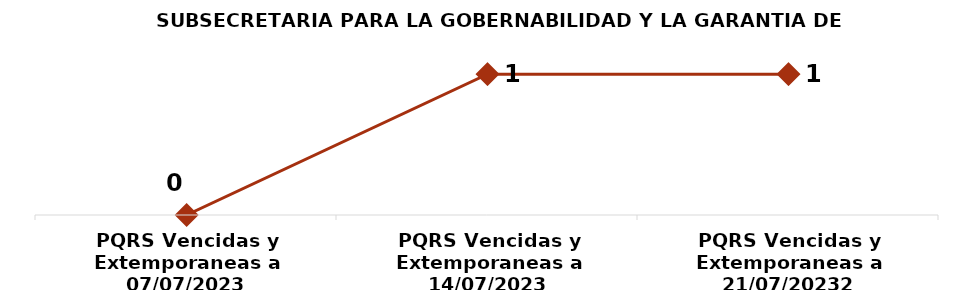
| Category | SUBSECRETARIA PARA LA GOBERNABILIDAD Y LA GARANTIA DE DERECHOS |
|---|---|
| PQRS Vencidas y Extemporaneas a 07/07/2023 | 0 |
| PQRS Vencidas y Extemporaneas a 14/07/2023 | 1 |
| PQRS Vencidas y Extemporaneas a 21/07/20232 | 1 |